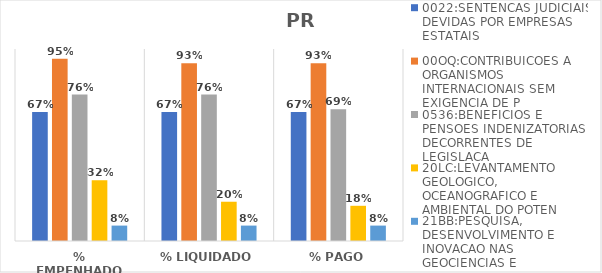
| Category | 0022:SENTENCAS JUDICIAIS DEVIDAS POR EMPRESAS ESTATAIS | 00OQ:CONTRIBUICOES A ORGANISMOS INTERNACIONAIS SEM EXIGENCIA DE P | 0536:BENEFICIOS E PENSOES INDENIZATORIAS DECORRENTES DE LEGISLACA | 20LC:LEVANTAMENTO GEOLOGICO, OCEANOGRAFICO E AMBIENTAL DO POTEN | 21BB:PESQUISA, DESENVOLVIMENTO E INOVACAO NAS GEOCIENCIAS E |
|---|---|---|---|---|---|
| % EMPENHADO | 0.671 | 0.95 | 0.763 | 0.316 | 0.08 |
| % LIQUIDADO | 0.671 | 0.926 | 0.763 | 0.205 | 0.08 |
| % PAGO | 0.671 | 0.926 | 0.687 | 0.183 | 0.08 |